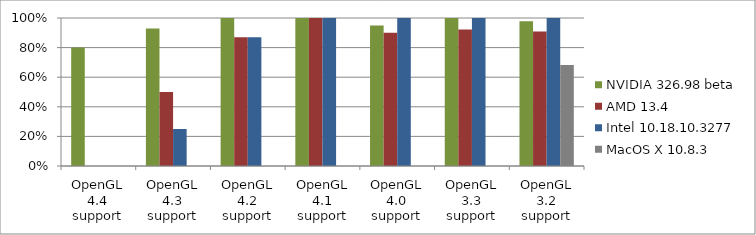
| Category | NVIDIA 326.98 beta | AMD 13.4 | Intel 10.18.10.3277 | MacOS X 10.8.3 |
|---|---|---|---|---|
| OpenGL 4.4 support | 0.8 | 0 | 0 | 0 |
| OpenGL 4.3 support | 0.929 | 0.5 | 0.25 | 0 |
| OpenGL 4.2 support | 1 | 0.87 | 0.87 | 0 |
| OpenGL 4.1 support | 1 | 1 | 1 | 0 |
| OpenGL 4.0 support | 0.95 | 0.9 | 1 | 0 |
| OpenGL 3.3 support | 1 | 0.923 | 1 | 0 |
| OpenGL 3.2 support | 0.977 | 0.909 | 1 | 0.682 |